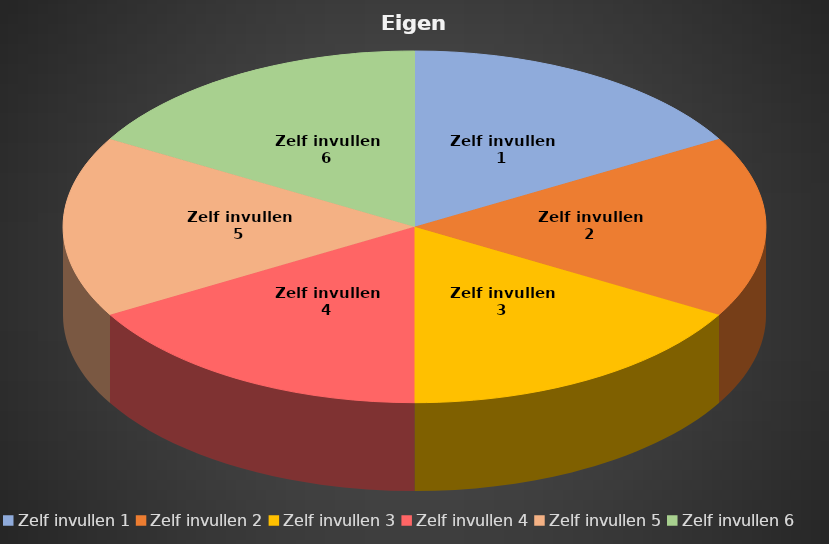
| Category | Series 0 |
|---|---|
| Zelf invullen 1 | 1000 |
| Zelf invullen 2 | 1000 |
| Zelf invullen 3 | 1000 |
| Zelf invullen 4 | 1000 |
| Zelf invullen 5 | 1000 |
| Zelf invullen 6 | 1000 |